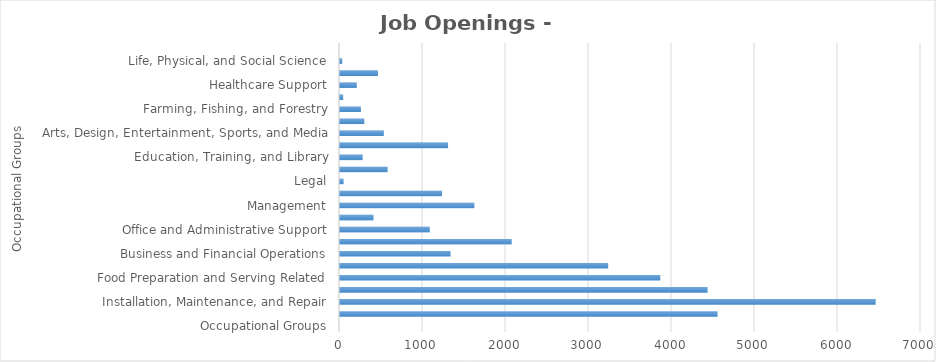
| Category | Series1 |
|---|---|
| Occupational Groups | 0 |
| Construction and Extraction | 4549 |
| Installation, Maintenance, and Repair | 6454 |
| Building and Grounds Cleaning and Maintenance | 4429 |
| Food Preparation and Serving Related | 3859 |
| Personal Care and Service | 3231 |
| Business and Financial Operations | 1332 |
| Sales and Related | 2069 |
| Office and Administrative Support | 1082 |
| Architecture and Engineering | 404 |
| Management | 1619 |
| Transportation and Material Moving | 1229 |
| Legal | 43 |
| Healthcare Practitioners and Technical | 574 |
| Education, Training, and Library | 273 |
| Production | 1302 |
| Arts, Design, Entertainment, Sports, and Media | 528 |
| Computer and Mathematical | 293 |
| Farming, Fishing, and Forestry | 252 |
| Community and Social Services | 38 |
| Healthcare Support | 202 |
| Protective Service | 457 |
| Life, Physical, and Social Science | 27 |
| Military Specific  | 0 |